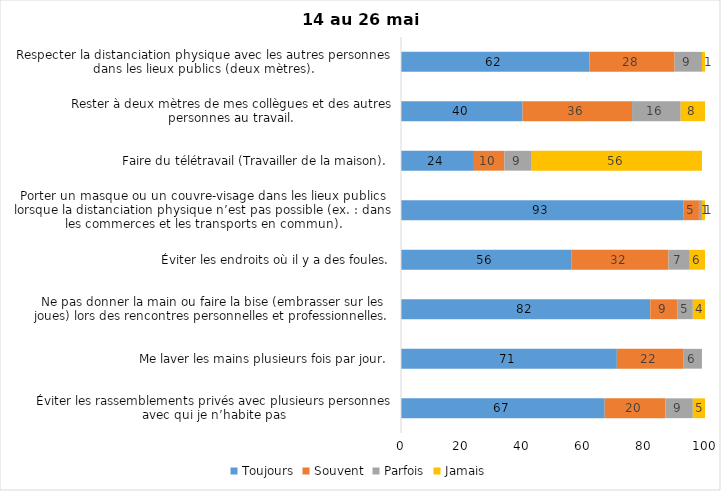
| Category | Toujours | Souvent | Parfois | Jamais |
|---|---|---|---|---|
| Éviter les rassemblements privés avec plusieurs personnes avec qui je n’habite pas | 67 | 20 | 9 | 5 |
| Me laver les mains plusieurs fois par jour. | 71 | 22 | 6 | 0 |
| Ne pas donner la main ou faire la bise (embrasser sur les joues) lors des rencontres personnelles et professionnelles. | 82 | 9 | 5 | 4 |
| Éviter les endroits où il y a des foules. | 56 | 32 | 7 | 6 |
| Porter un masque ou un couvre-visage dans les lieux publics lorsque la distanciation physique n’est pas possible (ex. : dans les commerces et les transports en commun). | 93 | 5 | 1 | 1 |
| Faire du télétravail (Travailler de la maison). | 24 | 10 | 9 | 56 |
| Rester à deux mètres de mes collègues et des autres personnes au travail. | 40 | 36 | 16 | 8 |
| Respecter la distanciation physique avec les autres personnes dans les lieux publics (deux mètres). | 62 | 28 | 9 | 1 |